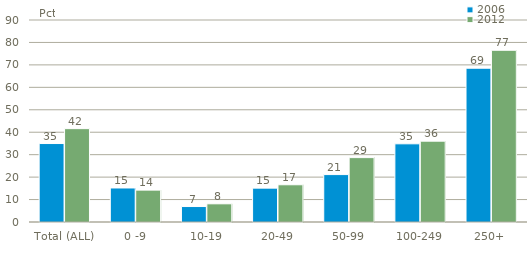
| Category | 2006 | 2012 |
|---|---|---|
| Total (ALL) | 34.959 | 41.59 |
| 0 -9 | 15.16 | 14.208 |
| 10-19 | 6.89 | 8.098 |
| 20-49 | 15.084 | 16.583 |
| 50-99 | 21.126 | 28.687 |
| 100-249 | 34.83 | 36.018 |
| 250+ | 68.514 | 76.51 |